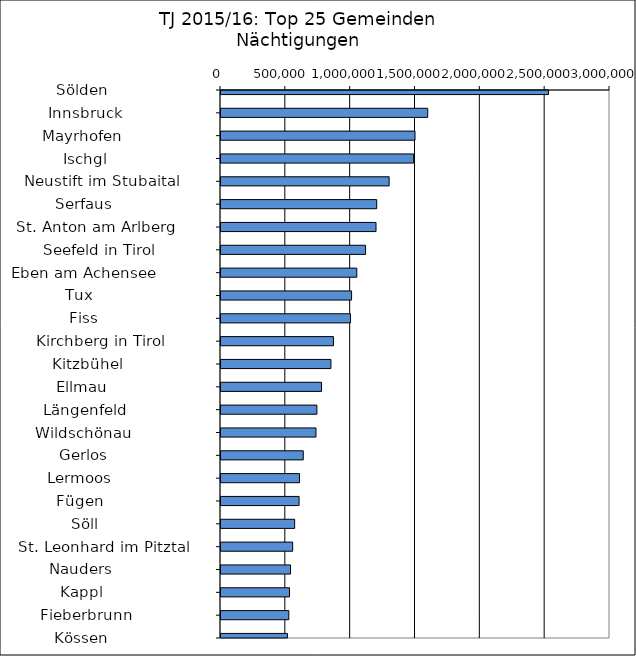
| Category | Series 0 |
|---|---|
|   Sölden                     | 2525871 |
|   Innsbruck                  | 1594002 |
|   Mayrhofen                  | 1496309 |
|   Ischgl                     | 1485853 |
|   Neustift im Stubaital      | 1296804 |
|   Serfaus                    | 1200764 |
|   St. Anton am Arlberg       | 1195562 |
|   Seefeld in Tirol           | 1114937 |
|   Eben am Achensee           | 1047279 |
|   Tux                        | 1007043 |
|   Fiss                       | 998384 |
|   Kirchberg in Tirol         | 867277 |
|   Kitzbühel                  | 847660 |
|   Ellmau                     | 775256 |
|   Längenfeld                 | 739602 |
|   Wildschönau                | 732437 |
|   Gerlos                     | 634419 |
|   Lermoos                    | 605607 |
|   Fügen                      | 602031 |
|   Söll                       | 567980 |
|   St. Leonhard im Pitztal    | 552645 |
|   Nauders                    | 536065 |
|   Kappl                      | 528231 |
|   Fieberbrunn                | 522893 |
|   Kössen                     | 512501 |